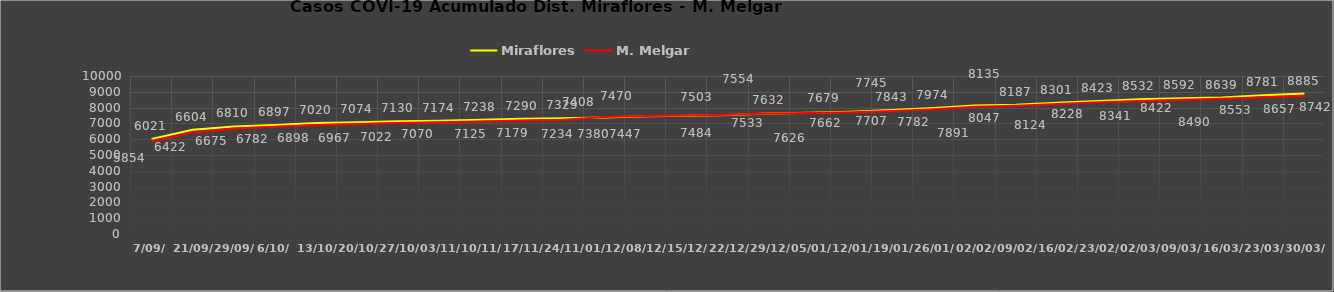
| Category | Miraflores | M. Melgar |
|---|---|---|
| 7/09/ | 6021 | 5854 |
| 21/09/ | 6604 | 6422 |
| 29/09/ | 6810 | 6675 |
| 6/10/ | 6897 | 6782 |
| 13/10/ | 7020 | 6898 |
| 20/10/ | 7074 | 6967 |
| 27/10/ | 7130 | 7022 |
| 03/11/ | 7174 | 7070 |
| 10/11/ | 7238 | 7125 |
| 17/11/ | 7290 | 7179 |
| 24/11/ | 7329 | 7234 |
| 01/12/ | 7380 | 7408 |
| 08/12/ | 7447 | 7470 |
| 15/12/ | 7484 | 7503 |
| 22/12/ | 7533 | 7554 |
| 29/12/ | 7632 | 7626 |
| 05/01/ | 7679 | 7662 |
| 12/01/ | 7745 | 7707 |
| 19/01/ | 7843 | 7782 |
| 26/01/ | 7974 | 7891 |
| 02/02/ | 8135 | 8047 |
| 09/02/ | 8187 | 8124 |
| 16/02/ | 8301 | 8228 |
| 23/02/ | 8423 | 8341 |
| 02/03/ | 8532 | 8422 |
| 09/03/ | 8592 | 8490 |
| 16/03/ | 8639 | 8553 |
| 23/03/ | 8781 | 8657 |
| 30/03/ | 8885 | 8742 |